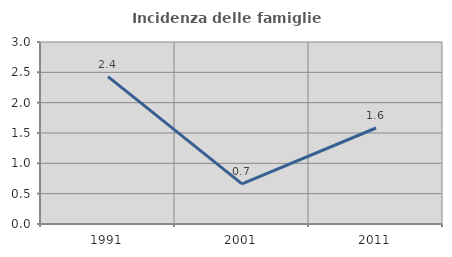
| Category | Incidenza delle famiglie numerose |
|---|---|
| 1991.0 | 2.431 |
| 2001.0 | 0.662 |
| 2011.0 | 1.582 |